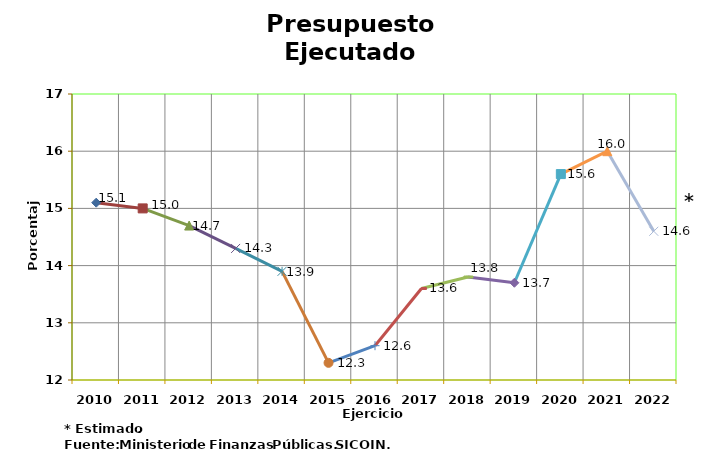
| Category | Series 1 |
|---|---|
| 2010 | 15.1 |
| 2011 | 15 |
| 2012 | 14.7 |
| 2013 | 14.3 |
| 2014 | 13.9 |
| 2015 | 12.3 |
| 2016 | 12.6 |
| 2017 | 13.6 |
| 2018 | 13.8 |
| 2019 | 13.7 |
| 2020 | 15.6 |
| 2021 | 16 |
| 2022 | 14.6 |